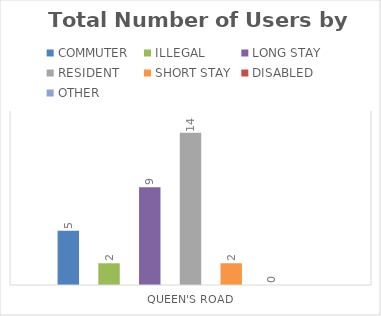
| Category | COMMUTER | ILLEGAL | LONG STAY | RESIDENT | SHORT STAY | DISABLED | OTHER |
|---|---|---|---|---|---|---|---|
| QUEEN'S ROAD | 5 | 2 | 9 | 14 | 2 | 0 | 0 |